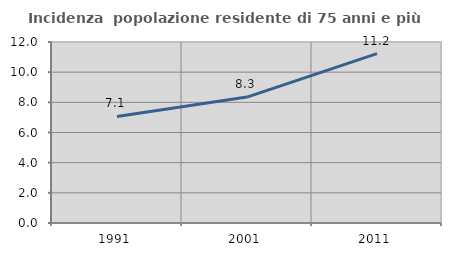
| Category | Incidenza  popolazione residente di 75 anni e più |
|---|---|
| 1991.0 | 7.067 |
| 2001.0 | 8.347 |
| 2011.0 | 11.232 |